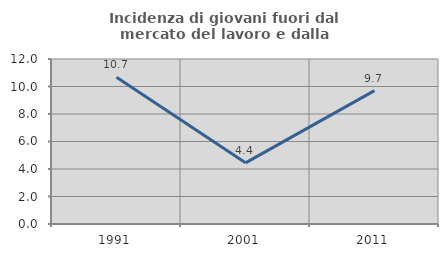
| Category | Incidenza di giovani fuori dal mercato del lavoro e dalla formazione  |
|---|---|
| 1991.0 | 10.678 |
| 2001.0 | 4.448 |
| 2011.0 | 9.696 |